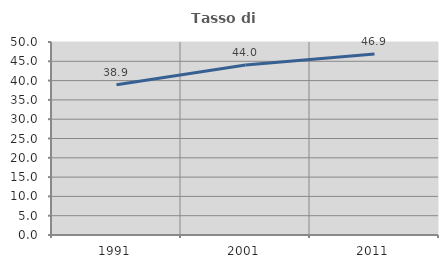
| Category | Tasso di occupazione   |
|---|---|
| 1991.0 | 38.912 |
| 2001.0 | 44.03 |
| 2011.0 | 46.918 |